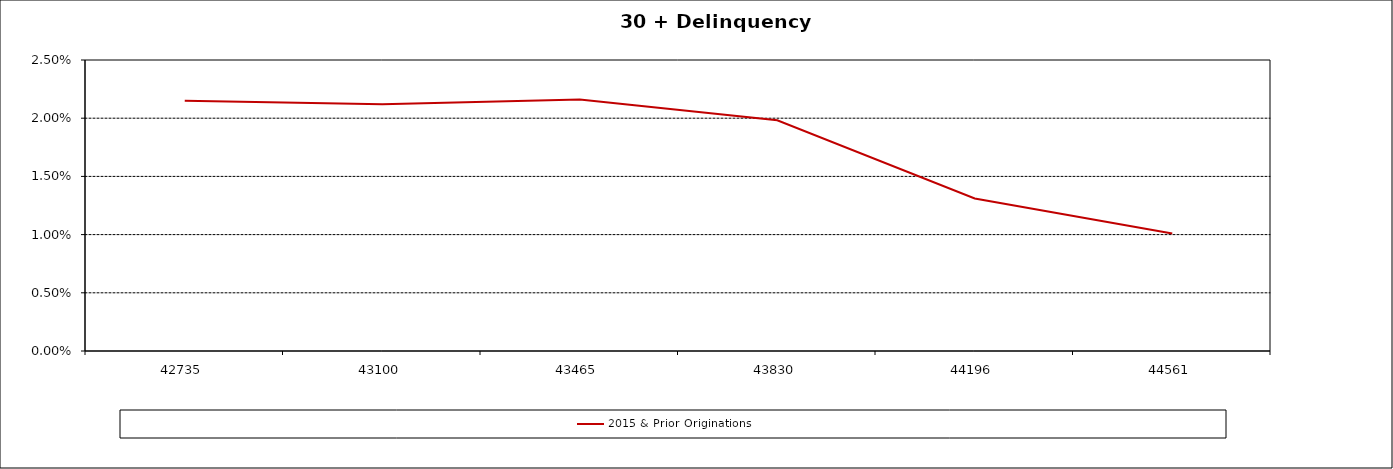
| Category | 2015 & Prior Originations |
|---|---|
| 2016-12-31 | 0.022 |
| 2017-12-31 | 0.021 |
| 2018-12-31 | 0.022 |
| 2019-12-31 | 0.02 |
| 2020-12-31 | 0.013 |
| 2021-12-31 | 0.01 |